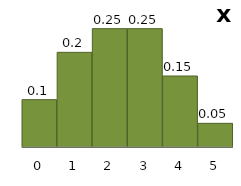
| Category | Series 1 |
|---|---|
| 0.0 | 0.1 |
| 1.0 | 0.2 |
| 2.0 | 0.25 |
| 3.0 | 0.25 |
| 4.0 | 0.15 |
| 5.0 | 0.05 |